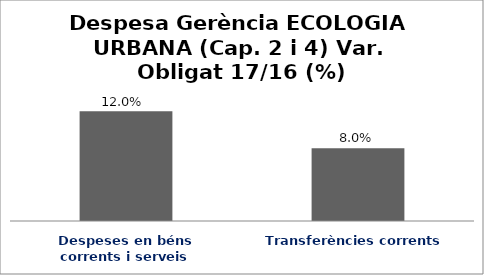
| Category | Series 0 |
|---|---|
| Despeses en béns corrents i serveis | 0.12 |
| Transferències corrents | 0.08 |